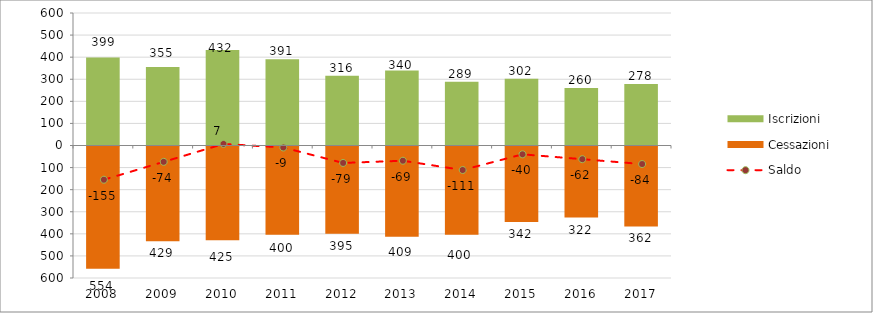
| Category | Iscrizioni | Cessazioni |
|---|---|---|
| 2008.0 | 399 | -554 |
| 2009.0 | 355 | -429 |
| 2010.0 | 432 | -425 |
| 2011.0 | 391 | -400 |
| 2012.0 | 316 | -395 |
| 2013.0 | 340 | -409 |
| 2014.0 | 289 | -400 |
| 2015.0 | 302 | -342 |
| 2016.0 | 260 | -322 |
| 2017.0 | 278 | -362 |